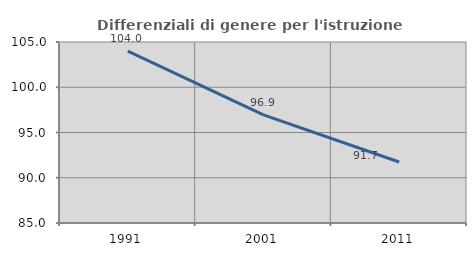
| Category | Differenziali di genere per l'istruzione superiore |
|---|---|
| 1991.0 | 103.991 |
| 2001.0 | 96.94 |
| 2011.0 | 91.74 |